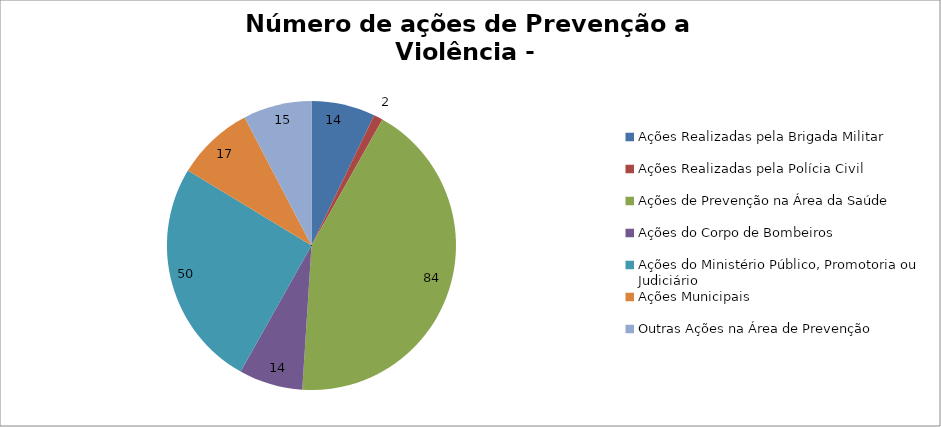
| Category | Número de Ações |
|---|---|
| Ações Realizadas pela Brigada Militar | 14 |
| Ações Realizadas pela Polícia Civil | 2 |
| Ações de Prevenção na Área da Saúde | 84 |
| Ações do Corpo de Bombeiros | 14 |
| Ações do Ministério Público, Promotoria ou Judiciário | 50 |
| Ações Municipais | 17 |
| Outras Ações na Área de Prevenção | 15 |